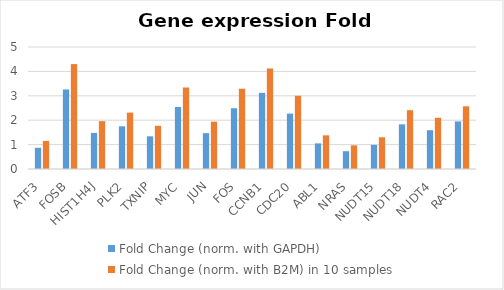
| Category | Fold Change (norm. with GAPDH) | Fold Change (norm. with B2M) in 10 samples |
|---|---|---|
| ATF3 | 0.87 | 1.15 |
| FOSB | 3.26 | 4.3 |
| HIST1H4J | 1.48 | 1.96 |
| PLK2 | 1.75 | 2.31 |
| TXNIP | 1.34 | 1.77 |
| MYC | 2.54 | 3.34 |
| JUN | 1.47 | 1.94 |
| FOS | 2.49 | 3.29 |
| CCNB1 | 3.12 | 4.12 |
| CDC20 | 2.27 | 3 |
| ABL1 | 1.05 | 1.38 |
| NRAS | 0.73 | 0.97 |
| NUDT15 | 0.99 | 1.3 |
| NUDT18 | 1.83 | 2.41 |
| NUDT4 | 1.59 | 2.1 |
| RAC2 | 1.95 | 2.57 |